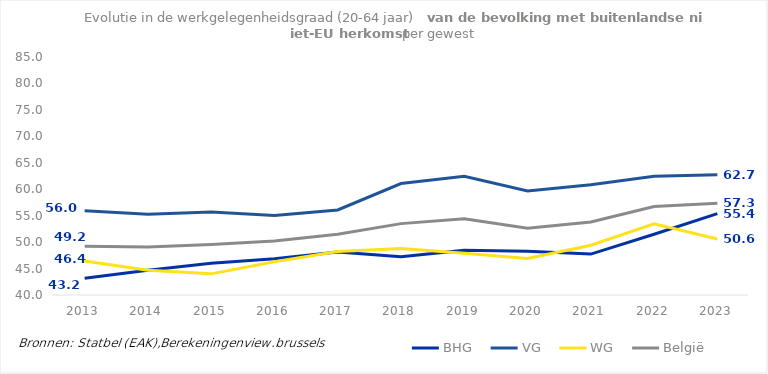
| Category | BHG | VG | WG | België |
|---|---|---|---|---|
| 2013.0 | 43.161 | 55.952 | 46.436 | 49.201 |
| 2014.0 | 44.699 | 55.287 | 44.661 | 49.095 |
| 2015.0 | 46.019 | 55.706 | 43.998 | 49.564 |
| 2016.0 | 46.853 | 55.041 | 46.293 | 50.203 |
| 2017.0 | 48.13 | 56.081 | 48.227 | 51.481 |
| 2018.0 | 47.231 | 61.079 | 48.8 | 53.495 |
| 2019.0 | 48.441 | 62.443 | 47.903 | 54.4 |
| 2020.0 | 48.283 | 59.659 | 46.899 | 52.615 |
| 2021.0 | 47.734 | 60.838 | 49.401 | 53.793 |
| 2022.0 | 51.495 | 62.437 | 53.469 | 56.741 |
| 2023.0 | 55.374 | 62.738 | 50.59 | 57.348 |